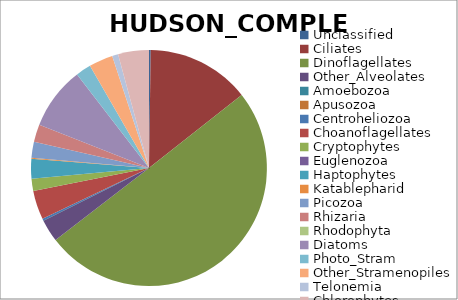
| Category | HUDSON_COMPLEX |
|---|---|
| Unclassified | 0.002 |
| Ciliates | 0.141 |
| Dinoflagellates | 0.502 |
| Other_Alveolates | 0.031 |
| Amoebozoa | 0 |
| Apusozoa | 0 |
| Centroheliozoa | 0.003 |
| Choanoflagellates | 0.04 |
| Cryptophytes | 0.017 |
| Euglenozoa | 0 |
| Haptophytes | 0.027 |
| Katablepharid | 0.001 |
| Picozoa | 0.022 |
| Rhizaria | 0.024 |
| Rhodophyta | 0 |
| Diatoms | 0.086 |
| Photo_Stram | 0.021 |
| Other_Stramenopiles | 0.033 |
| Telonemia | 0.008 |
| Chlorophytes | 0.042 |